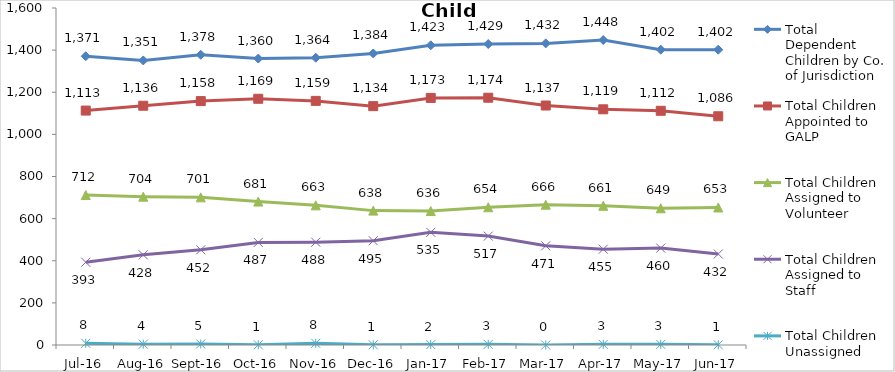
| Category | Total Dependent Children by Co. of Jurisdiction | Total Children Appointed to GALP | Total Children Assigned to Volunteer | Total Children Assigned to Staff | Total Children Unassigned |
|---|---|---|---|---|---|
| Jul-16 | 1371 | 1113 | 712 | 393 | 8 |
| Aug-16 | 1351 | 1136 | 704 | 428 | 4 |
| Sep-16 | 1378 | 1158 | 701 | 452 | 5 |
| Oct-16 | 1360 | 1169 | 681 | 487 | 1 |
| Nov-16 | 1364 | 1159 | 663 | 488 | 8 |
| Dec-16 | 1384 | 1134 | 638 | 495 | 1 |
| Jan-17 | 1423 | 1173 | 636 | 535 | 2 |
| Feb-17 | 1429 | 1174 | 654 | 517 | 3 |
| Mar-17 | 1432 | 1137 | 666 | 471 | 0 |
| Apr-17 | 1448 | 1119 | 661 | 455 | 3 |
| May-17 | 1402 | 1112 | 649 | 460 | 3 |
| Jun-17 | 1402 | 1086 | 653 | 432 | 1 |